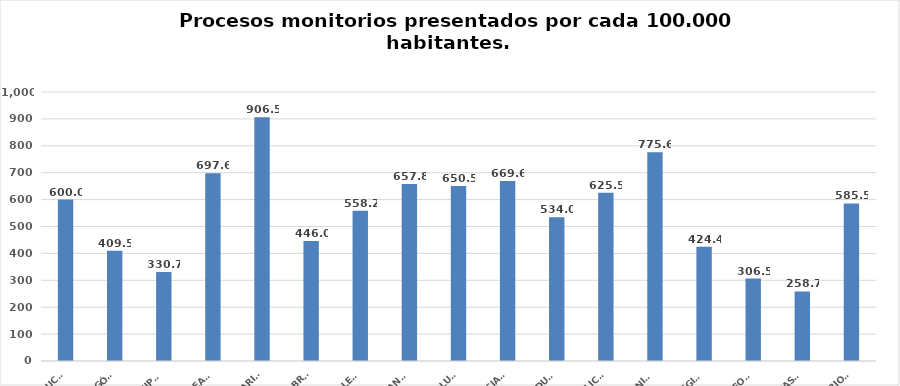
| Category | Series 0 |
|---|---|
| ANDALUCÍA | 600.025 |
| ARAGÓN | 409.537 |
| ASTURIAS, PRINCIPADO | 330.716 |
| ILLES BALEARS | 697.59 |
| CANARIAS | 906.456 |
| CANTABRIA | 446.027 |
| CASTILLA - LEÓN | 558.223 |
| CASTILLA - LA MANCHA | 657.831 |
| CATALUÑA | 650.495 |
| C. VALENCIANA | 669.571 |
| EXTREMADURA | 534.001 |
| GALICIA | 625.547 |
| MADRID, COMUNIDAD | 775.622 |
| MURCIA, REGIÓN | 424.361 |
| NAVARRA, COM. FORAL | 306.456 |
| PAÍS VASCO | 258.659 |
| LA RIOJA | 585.547 |